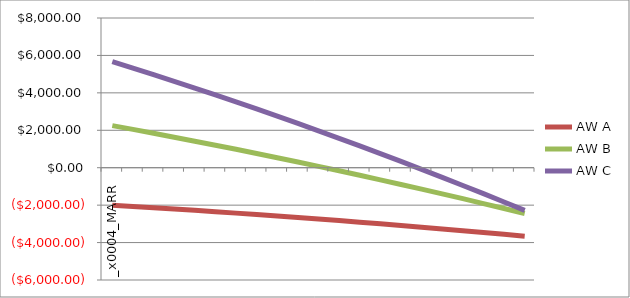
| Category | AW A | AW B | AW C |
|---|---|---|---|
| 0 | -2000 | 2250 | 5666.667 |
| 1 | -2067.345 | 2046.472 | 5322.304 |
| 2 | -2136.092 | 1839.984 | 4972.493 |
| 3 | -2206.305 | 1630.44 | 4617.158 |
| 4 | -2278.042 | 1417.753 | 4256.235 |
| 5 | -2351.355 | 1201.846 | 3889.675 |
| 6 | -2426.293 | 982.651 | 3517.442 |
| 7 | -2502.896 | 760.112 | 3139.513 |
| 8 | -2581.201 | 534.182 | 2755.877 |
| 9 | -2661.238 | 304.821 | 2366.537 |
| 10 | -2743.033 | 72.004 | 1971.508 |
| 11 | -2826.606 | -164.291 | 1570.816 |
| 12 | -2911.974 | -404.073 | 1164.5 |
| 13 | -2999.146 | -647.344 | 752.607 |
| 14 | -3088.13 | -894.099 | 335.196 |
| 15 | -3178.929 | -1144.324 | -87.667 |
| 16 | -3271.54 | -1398.001 | -515.906 |
| 17 | -3365.96 | -1655.104 | -949.439 |
| 18 | -3462.18 | -1915.601 | -1388.177 |
| 19 | -3560.189 | -2179.455 | -1832.024 |
| 20 | -3659.974 | -2446.625 | -2280.879 |